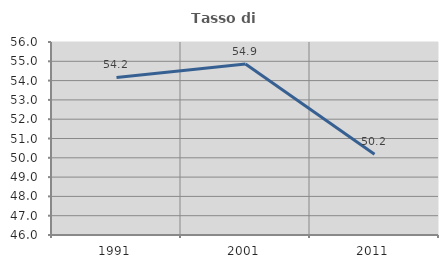
| Category | Tasso di occupazione   |
|---|---|
| 1991.0 | 54.167 |
| 2001.0 | 54.862 |
| 2011.0 | 50.183 |